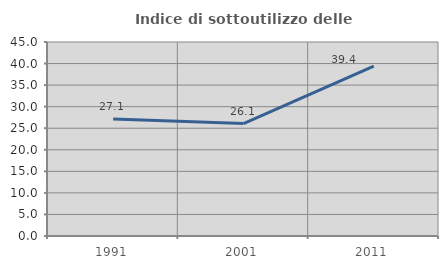
| Category | Indice di sottoutilizzo delle abitazioni  |
|---|---|
| 1991.0 | 27.119 |
| 2001.0 | 26.087 |
| 2011.0 | 39.394 |